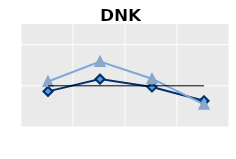
| Category | Foreign-born | Native-born | Series 1 |
|---|---|---|---|
| 15-24 | 0.865 | 1.104 | 1 |
| 25-54 | 1.162 | 1.591 | 1 |
| 55-64 | 0.973 | 1.172 | 1 |
| 65+ | 0.635 | 0.551 | 1 |